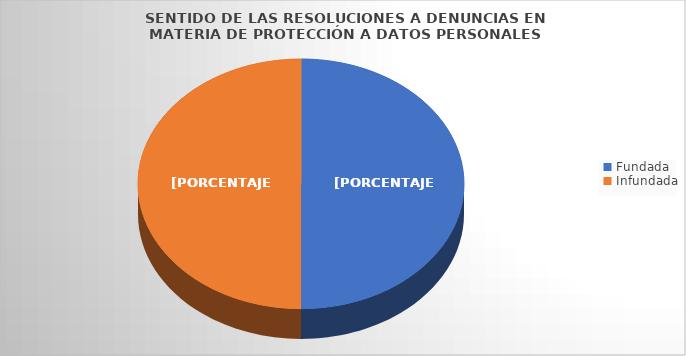
| Category | Series 0 |
|---|---|
| Fundada  | 2 |
| Infundada | 2 |